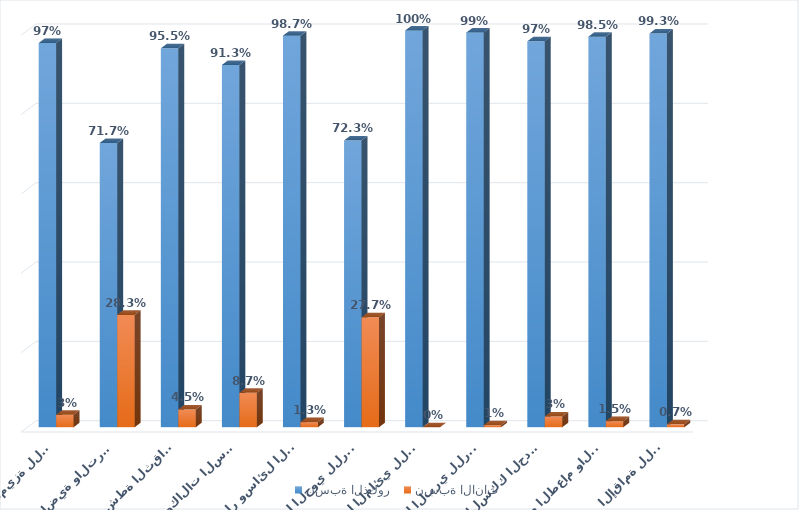
| Category | نسبة الذكور  | نسبة الاناث |
|---|---|---|
|  الإقامة للزوّار | 0.993 | 0.007 |
| نشاط تقديم الطعام والشراب | 0.985 | 0.015 |
|  نقل الركاب بالسكك الحديدية | 0.973 | 0.027 |
|  النقل البري للركاب | 0.995 | 0.005 |
|  النقل المائي للركاب | 1 | 0 |
|  النقل الجوي للركاب | 0.723 | 0.277 |
|  استئجار وسائل النقل | 0.987 | 0.013 |
|   وكالات السفر  | 0.913 | 0.087 |
| الأنشطة الثقافية | 0.955 | 0.045 |
| الأنشطة الرياضية والترفيهية | 0.717 | 0.283 |
| الأنشطةالأخرى المميزة للسياحة | 0.968 | 0.032 |